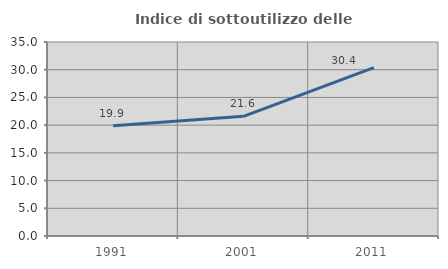
| Category | Indice di sottoutilizzo delle abitazioni  |
|---|---|
| 1991.0 | 19.892 |
| 2001.0 | 21.597 |
| 2011.0 | 30.383 |